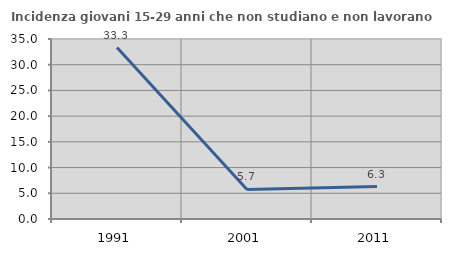
| Category | Incidenza giovani 15-29 anni che non studiano e non lavorano  |
|---|---|
| 1991.0 | 33.333 |
| 2001.0 | 5.738 |
| 2011.0 | 6.299 |